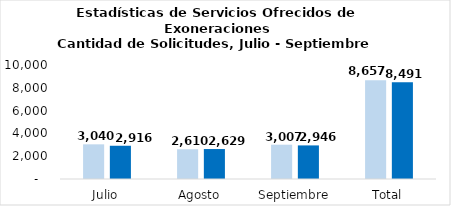
| Category | Tramitadas |
|---|---|
| Julio | 2916 |
| Agosto | 2629 |
| Septiembre | 2946 |
| Total | 8491 |